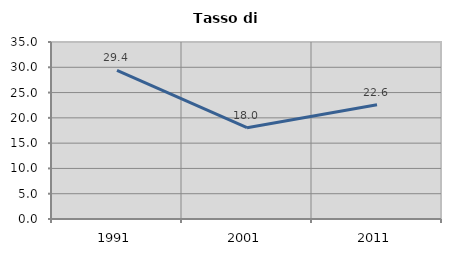
| Category | Tasso di disoccupazione   |
|---|---|
| 1991.0 | 29.409 |
| 2001.0 | 18.049 |
| 2011.0 | 22.608 |